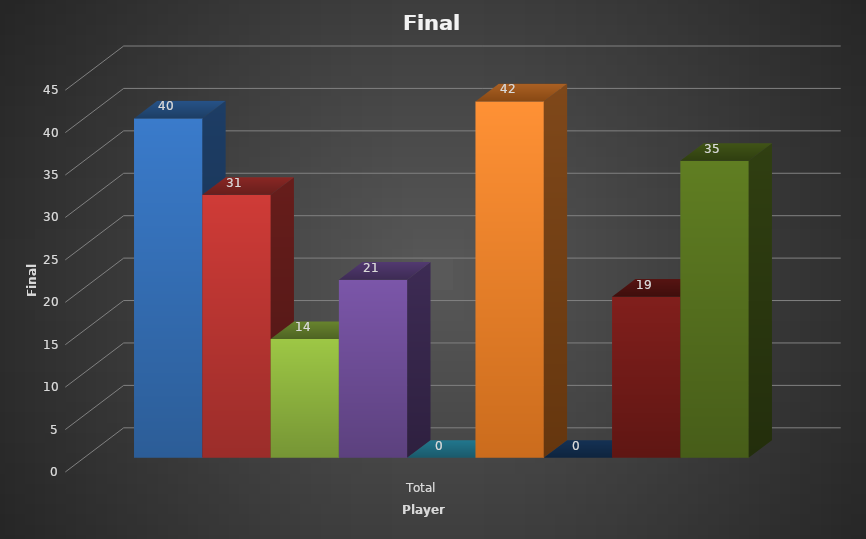
| Category | Barbara  | Ann  | Flo  | Rose | Emily  | Josie  | Lin  | Joan  | Eva  |
|---|---|---|---|---|---|---|---|---|---|
| Total | 40 | 31 | 14 | 21 | 0 | 42 | 0 | 19 | 35 |